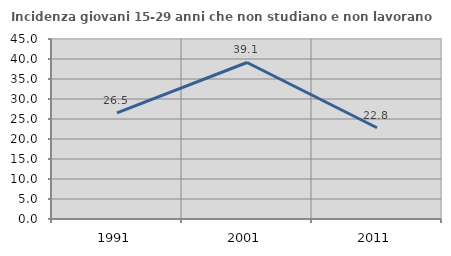
| Category | Incidenza giovani 15-29 anni che non studiano e non lavorano  |
|---|---|
| 1991.0 | 26.513 |
| 2001.0 | 39.13 |
| 2011.0 | 22.807 |